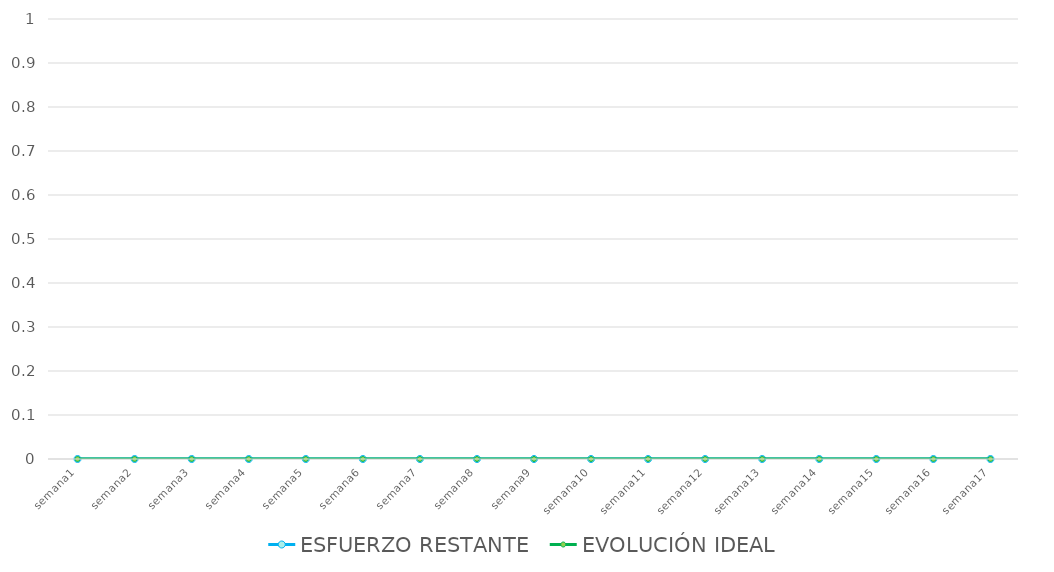
| Category | ESFUERZO RESTANTE | EVOLUCIÓN IDEAL |
|---|---|---|
| semana1 | 0 | 0 |
| semana2 | 0 | 0 |
| semana3 | 0 | 0 |
| semana4 | 0 | 0 |
| semana5 | 0 | 0 |
| semana6 | 0 | 0 |
| semana7 | 0 | 0 |
| semana8 | 0 | 0 |
| semana9 | 0 | 0 |
| semana10 | 0 | 0 |
| semana11 | 0 | 0 |
| semana12 | 0 | 0 |
| semana13 | 0 | 0 |
| semana14 | 0 | 0 |
| semana15 | 0 | 0 |
| semana16 | 0 | 0 |
| semana17 | 0 | 0 |